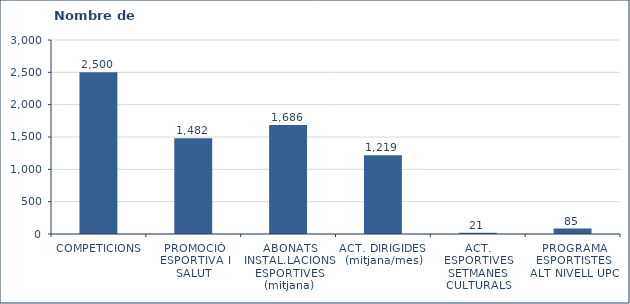
| Category | Nombre de participants |
|---|---|
| COMPETICIONS | 2500 |
| PROMOCIÓ ESPORTIVA I SALUT | 1482 |
| ABONATS INSTAL.LACIONS ESPORTIVES (mitjana) | 1686 |
| ACT. DIRIGIDES  (mitjana/mes) | 1219 |
| ACT. ESPORTIVES SETMANES CULTURALS | 21 |
| PROGRAMA ESPORTISTES ALT NIVELL UPC | 85 |